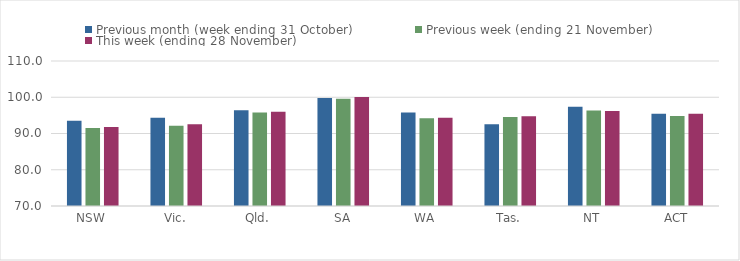
| Category | Previous month (week ending 31 October) | Previous week (ending 21 November) | This week (ending 28 November) |
|---|---|---|---|
| NSW | 93.53 | 91.52 | 91.81 |
| Vic. | 94.36 | 92.14 | 92.52 |
| Qld. | 96.4 | 95.76 | 96.03 |
| SA | 99.82 | 99.57 | 100.08 |
| WA | 95.77 | 94.19 | 94.36 |
| Tas. | 92.57 | 94.52 | 94.75 |
| NT | 97.35 | 96.34 | 96.19 |
| ACT | 95.46 | 94.85 | 95.47 |